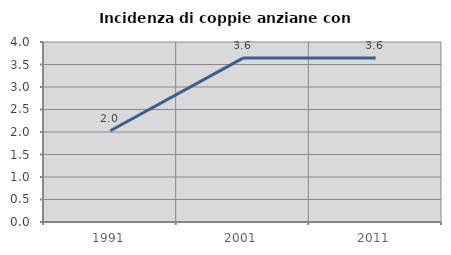
| Category | Incidenza di coppie anziane con figli |
|---|---|
| 1991.0 | 2.028 |
| 2001.0 | 3.642 |
| 2011.0 | 3.647 |